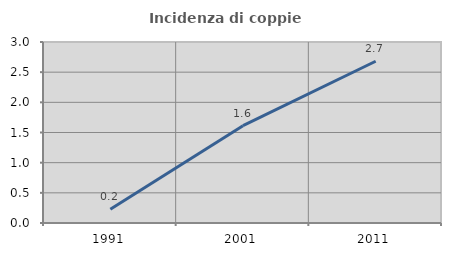
| Category | Incidenza di coppie miste |
|---|---|
| 1991.0 | 0.23 |
| 2001.0 | 1.613 |
| 2011.0 | 2.681 |